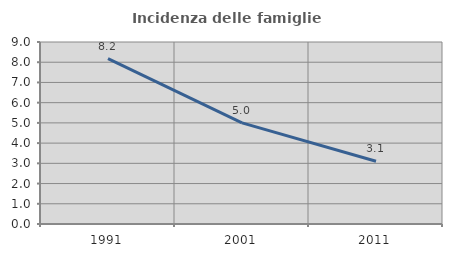
| Category | Incidenza delle famiglie numerose |
|---|---|
| 1991.0 | 8.179 |
| 2001.0 | 5 |
| 2011.0 | 3.105 |